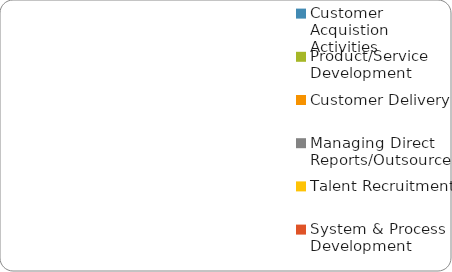
| Category | Series 0 |
|---|---|
| Customer Acquistion Activities | 0 |
| Product/Service Development | 0 |
| Customer Delivery | 0 |
| Managing Direct Reports/Outsource | 0 |
| Talent Recruitment | 0 |
| System & Process Development | 0 |
| Cash Flow Planning | 0 |
| Strategic Planning | 0 |
| Non-business related activities | 0 |
| Buffer Time | 0 |